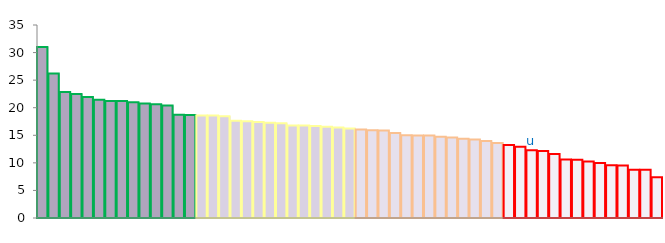
| Category | Top Quartile | 2nd Quartile | 3rd Quartile | Bottom Quartile | Series 4 |
|---|---|---|---|---|---|
|  | 30.996 | 0 | 0 | 0 | 30.996 |
|  | 26.218 | 0 | 0 | 0 | 26.218 |
|  | 22.857 | 0 | 0 | 0 | 22.857 |
|  | 22.508 | 0 | 0 | 0 | 22.508 |
|  | 21.925 | 0 | 0 | 0 | 21.925 |
|  | 21.448 | 0 | 0 | 0 | 21.448 |
|  | 21.239 | 0 | 0 | 0 | 21.239 |
|  | 21.215 | 0 | 0 | 0 | 21.215 |
|  | 20.988 | 0 | 0 | 0 | 20.988 |
|  | 20.778 | 0 | 0 | 0 | 20.778 |
|  | 20.609 | 0 | 0 | 0 | 20.609 |
|  | 20.383 | 0 | 0 | 0 | 20.383 |
|  | 18.713 | 0 | 0 | 0 | 18.713 |
|  | 18.675 | 0 | 0 | 0 | 18.675 |
|  | 0 | 18.608 | 0 | 0 | 18.608 |
|  | 0 | 18.598 | 0 | 0 | 18.598 |
|  | 0 | 18.455 | 0 | 0 | 18.455 |
|  | 0 | 17.639 | 0 | 0 | 17.639 |
|  | 0 | 17.532 | 0 | 0 | 17.532 |
|  | 0 | 17.404 | 0 | 0 | 17.404 |
|  | 0 | 17.275 | 0 | 0 | 17.275 |
|  | 0 | 17.18 | 0 | 0 | 17.18 |
|  | 0 | 16.797 | 0 | 0 | 16.797 |
|  | 0 | 16.795 | 0 | 0 | 16.795 |
|  | 0 | 16.69 | 0 | 0 | 16.69 |
|  | 0 | 16.532 | 0 | 0 | 16.532 |
|  | 0 | 16.401 | 0 | 0 | 16.401 |
|  | 0 | 16.214 | 0 | 0 | 16.214 |
|  | 0 | 0 | 16.056 | 0 | 16.056 |
|  | 0 | 0 | 15.926 | 0 | 15.926 |
|  | 0 | 0 | 15.881 | 0 | 15.881 |
|  | 0 | 0 | 15.407 | 0 | 15.407 |
|  | 0 | 0 | 14.986 | 0 | 14.986 |
|  | 0 | 0 | 14.984 | 0 | 14.984 |
|  | 0 | 0 | 14.945 | 0 | 14.945 |
|  | 0 | 0 | 14.736 | 0 | 14.736 |
|  | 0 | 0 | 14.606 | 0 | 14.606 |
|  | 0 | 0 | 14.389 | 0 | 14.389 |
|  | 0 | 0 | 14.229 | 0 | 14.229 |
|  | 0 | 0 | 13.948 | 0 | 13.948 |
|  | 0 | 0 | 13.603 | 0 | 13.603 |
|  | 0 | 0 | 0 | 13.245 | 13.245 |
|  | 0 | 0 | 0 | 12.935 | 12.935 |
| u | 0 | 0 | 0 | 12.305 | 12.305 |